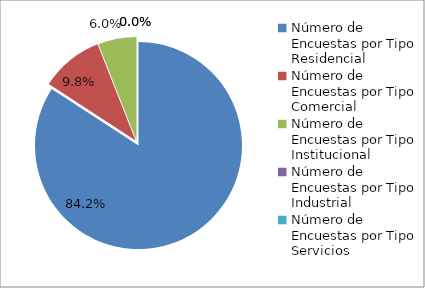
| Category | Series 0 |
|---|---|
| 0 | 197 |
| 1 | 23 |
| 2 | 14 |
| 3 | 0 |
| 4 | 0 |